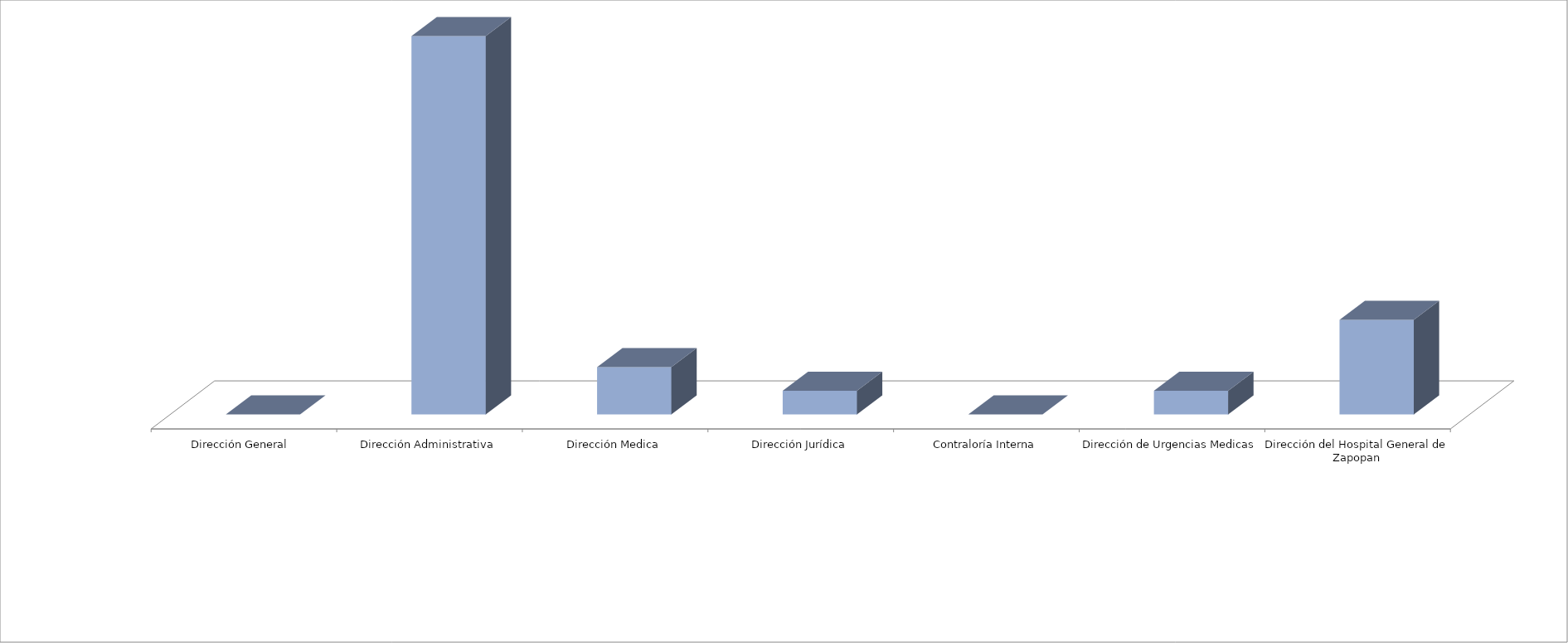
| Category | Series 0 | Series 1 |
|---|---|---|
| Dirección General  |  | 0 |
| Dirección Administrativa |  | 16 |
| Dirección Medica |  | 2 |
| Dirección Jurídica |  | 1 |
| Contraloría Interna |  | 0 |
| Dirección de Urgencias Medicas |  | 1 |
| Dirección del Hospital General de Zapopan |  | 4 |